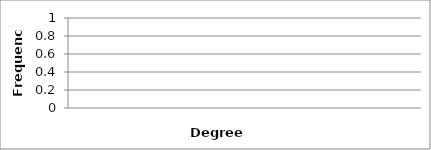
| Category | 0 |
|---|---|
| 0.0 | 0 |
| 0.0 | 0 |
| 0.0 | 0 |
| 0.0 | 0 |
| 0.0 | 0 |
| 0.0 | 0 |
| 0.0 | 0 |
| 0.0 | 0 |
| 0.0 | 0 |
| 0.0 | 0 |
| 0.0 | 0 |
| 0.0 | 0 |
| 0.0 | 0 |
| 0.0 | 0 |
| 0.0 | 0 |
| 0.0 | 0 |
| 0.0 | 0 |
| 0.0 | 0 |
| 0.0 | 0 |
| 0.0 | 0 |
| 0.0 | 0 |
| 0.0 | 0 |
| 0.0 | 0 |
| 0.0 | 0 |
| 0.0 | 0 |
| 0.0 | 0 |
| 0.0 | 0 |
| 0.0 | 0 |
| 0.0 | 0 |
| 0.0 | 0 |
| 0.0 | 0 |
| 0.0 | 0 |
| 0.0 | 0 |
| 0.0 | 0 |
| 0.0 | 0 |
| 0.0 | 0 |
| 0.0 | 0 |
| 0.0 | 0 |
| 0.0 | 0 |
| 0.0 | 0 |
| 0.0 | 0 |
| 0.0 | 0 |
| 0.0 | 0 |
| 0.0 | 0 |